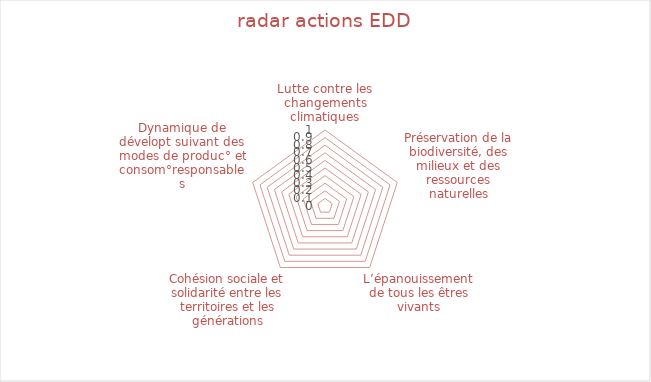
| Category | Series 0 |
|---|---|
| Lutte contre les changements climatiques | 0 |
| Préservation de la biodiversité, des milieux et des ressources naturelles | 0 |
| L’épanouissement de tous les êtres vivants | 0 |
| Cohésion sociale et solidarité entre les territoires et les générations | 0 |
| Dynamique de dévelopt suivant des modes de produc° et consom°responsables | 0 |